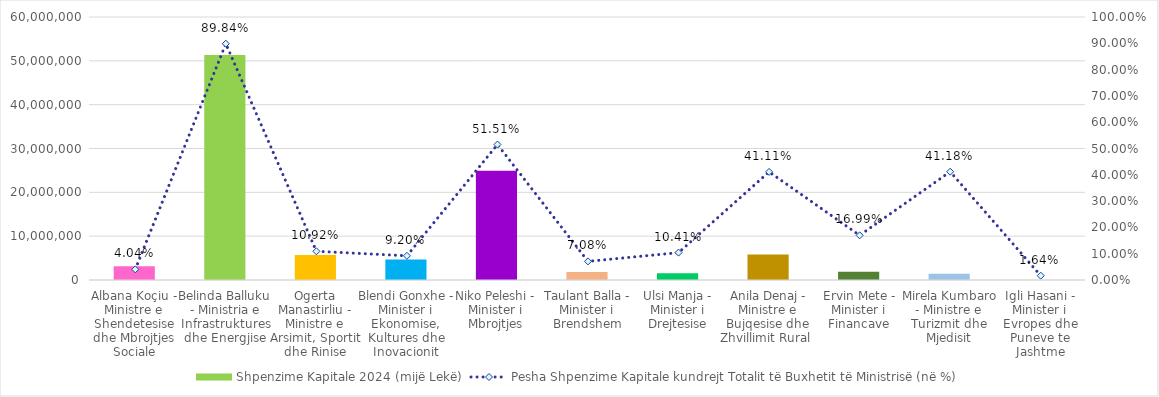
| Category | Shpenzime Kapitale 2024 (mijë Lekë) |
|---|---|
| Albana Koçiu - Ministre e Shendetesise dhe Mbrojtjes Sociale | 3161700 |
| Belinda Balluku - Ministria e Infrastruktures dhe Energjise | 51334556 |
| Ogerta Manastirliu - Ministre e Arsimit, Sportit dhe Rinise | 5704000 |
| Blendi Gonxhe - Minister i Ekonomise, Kultures dhe Inovacionit | 4703569 |
| Niko Peleshi - Minister i Mbrojtjes | 24899050 |
| Taulant Balla - Minister i Brendshem | 1836622 |
| Ulsi Manja - Minister i Drejtesise | 1533820 |
| Anila Denaj - Ministre e Bujqesise dhe Zhvillimit Rural  | 5829846 |
| Ervin Mete - Minister i Financave | 1855910 |
| Mirela Kumbaro - Ministre e Turizmit dhe Mjedisit | 1450847 |
| Igli Hasani - Minister i Evropes dhe Puneve te Jashtme | 53000 |